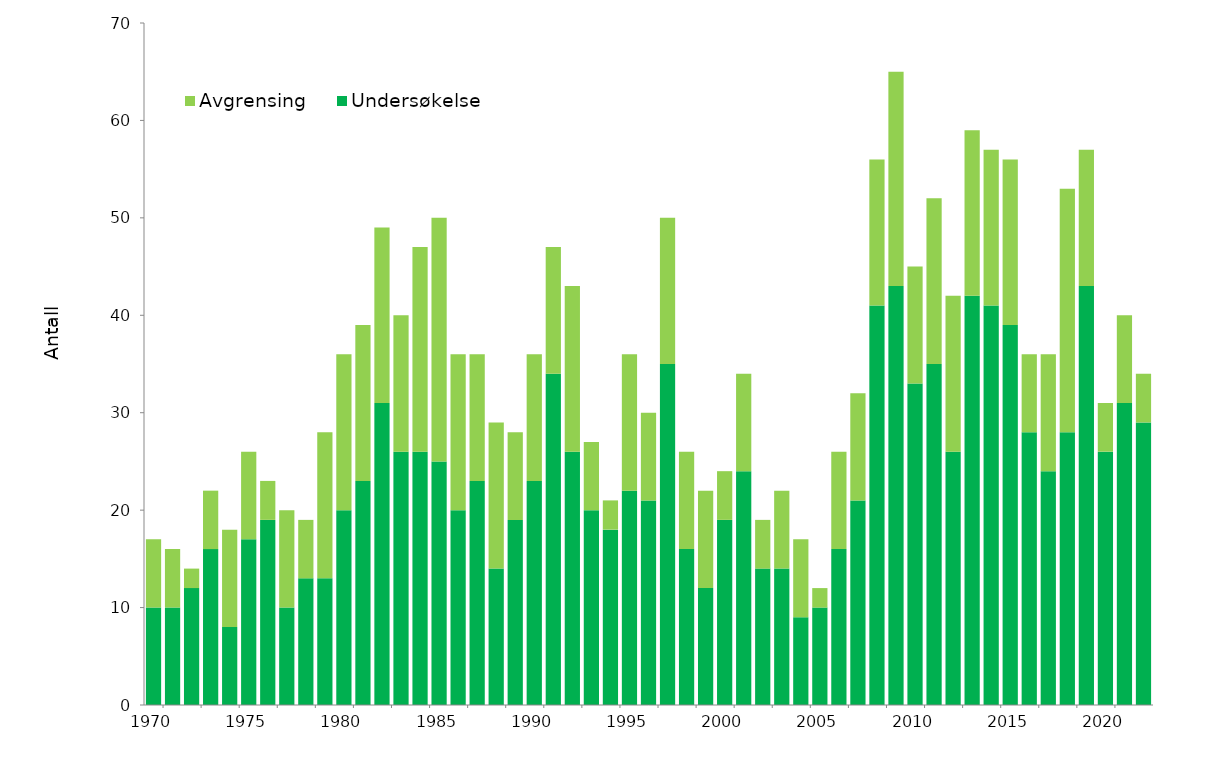
| Category | Undersøkelse | Avgrensing |
|---|---|---|
| 1970.0 | 10 | 7 |
| 1971.0 | 10 | 6 |
| 1972.0 | 12 | 2 |
| 1973.0 | 16 | 6 |
| 1974.0 | 8 | 10 |
| 1975.0 | 17 | 9 |
| 1976.0 | 19 | 4 |
| 1977.0 | 10 | 10 |
| 1978.0 | 13 | 6 |
| 1979.0 | 13 | 15 |
| 1980.0 | 20 | 16 |
| 1981.0 | 23 | 16 |
| 1982.0 | 31 | 18 |
| 1983.0 | 26 | 14 |
| 1984.0 | 26 | 21 |
| 1985.0 | 25 | 25 |
| 1986.0 | 20 | 16 |
| 1987.0 | 23 | 13 |
| 1988.0 | 14 | 15 |
| 1989.0 | 19 | 9 |
| 1990.0 | 23 | 13 |
| 1991.0 | 34 | 13 |
| 1992.0 | 26 | 17 |
| 1993.0 | 20 | 7 |
| 1994.0 | 18 | 3 |
| 1995.0 | 22 | 14 |
| 1996.0 | 21 | 9 |
| 1997.0 | 35 | 15 |
| 1998.0 | 16 | 10 |
| 1999.0 | 12 | 10 |
| 2000.0 | 19 | 5 |
| 2001.0 | 24 | 10 |
| 2002.0 | 14 | 5 |
| 2003.0 | 14 | 8 |
| 2004.0 | 9 | 8 |
| 2005.0 | 10 | 2 |
| 2006.0 | 16 | 10 |
| 2007.0 | 21 | 11 |
| 2008.0 | 41 | 15 |
| 2009.0 | 43 | 22 |
| 2010.0 | 33 | 12 |
| 2011.0 | 35 | 17 |
| 2012.0 | 26 | 16 |
| 2013.0 | 42 | 17 |
| 2014.0 | 41 | 16 |
| 2015.0 | 39 | 17 |
| 2016.0 | 28 | 8 |
| 2017.0 | 24 | 12 |
| 2018.0 | 28 | 25 |
| 2019.0 | 43 | 14 |
| 2020.0 | 26 | 5 |
| 2021.0 | 31 | 9 |
| 2022.0 | 29 | 5 |